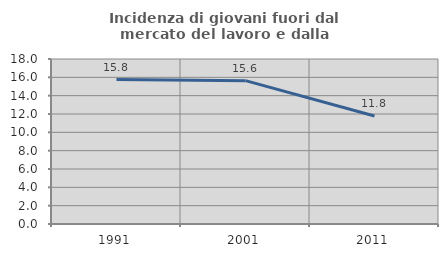
| Category | Incidenza di giovani fuori dal mercato del lavoro e dalla formazione  |
|---|---|
| 1991.0 | 15.76 |
| 2001.0 | 15.638 |
| 2011.0 | 11.785 |